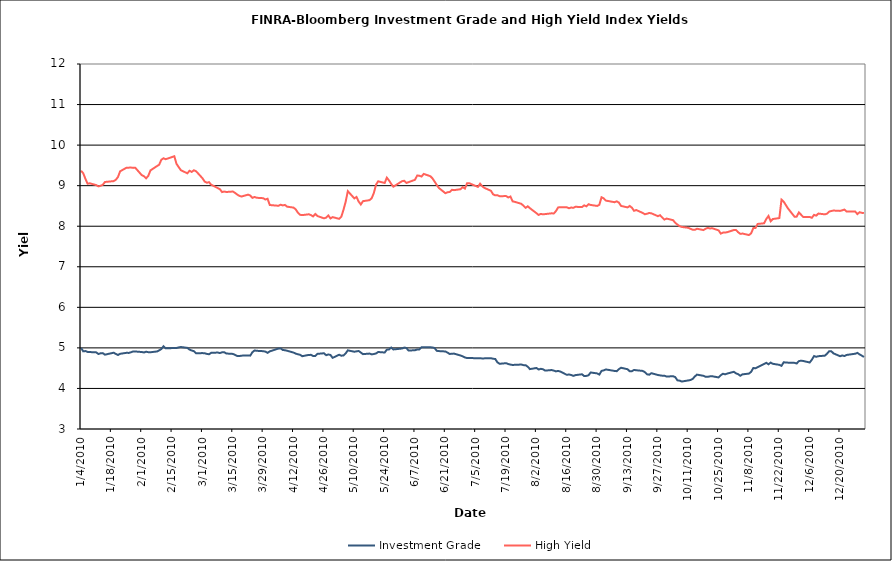
| Category | Investment Grade | High Yield |
|---|---|---|
| 1/4/10 | 4.999 | 9.369 |
| 1/5/10 | 4.915 | 9.304 |
| 1/6/10 | 4.922 | 9.169 |
| 1/7/10 | 4.901 | 9.047 |
| 1/8/10 | 4.898 | 9.058 |
| 1/11/10 | 4.889 | 9.014 |
| 1/12/10 | 4.849 | 8.983 |
| 1/13/10 | 4.867 | 8.998 |
| 1/14/10 | 4.871 | 9.02 |
| 1/15/10 | 4.832 | 9.091 |
| 1/19/10 | 4.881 | 9.112 |
| 1/20/10 | 4.852 | 9.144 |
| 1/21/10 | 4.825 | 9.212 |
| 1/22/10 | 4.854 | 9.354 |
| 1/25/10 | 4.879 | 9.444 |
| 1/26/10 | 4.876 | 9.444 |
| 1/27/10 | 4.892 | 9.447 |
| 1/28/10 | 4.912 | 9.438 |
| 1/29/10 | 4.911 | 9.441 |
| 2/1/10 | 4.898 | 9.258 |
| 2/2/10 | 4.887 | 9.234 |
| 2/3/10 | 4.905 | 9.182 |
| 2/4/10 | 4.894 | 9.243 |
| 2/5/10 | 4.893 | 9.376 |
| 2/8/10 | 4.912 | 9.483 |
| 2/9/10 | 4.939 | 9.516 |
| 2/10/10 | 4.971 | 9.639 |
| 2/11/10 | 5.039 | 9.675 |
| 2/12/10 | 4.988 | 9.653 |
| 2/16/10 | 4.997 | 9.725 |
| 2/17/10 | 4.998 | 9.538 |
| 2/18/10 | 5.011 | 9.459 |
| 2/19/10 | 5.022 | 9.382 |
| 2/22/10 | 5 | 9.304 |
| 2/23/10 | 4.958 | 9.367 |
| 2/24/10 | 4.935 | 9.339 |
| 2/25/10 | 4.92 | 9.38 |
| 2/26/10 | 4.868 | 9.358 |
| 3/1/10 | 4.871 | 9.182 |
| 3/2/10 | 4.868 | 9.1 |
| 3/3/10 | 4.852 | 9.072 |
| 3/4/10 | 4.843 | 9.086 |
| 3/5/10 | 4.878 | 9.023 |
| 3/8/10 | 4.885 | 8.941 |
| 3/9/10 | 4.872 | 8.914 |
| 3/10/10 | 4.891 | 8.842 |
| 3/11/10 | 4.893 | 8.854 |
| 3/12/10 | 4.861 | 8.844 |
| 3/15/10 | 4.852 | 8.855 |
| 3/16/10 | 4.828 | 8.822 |
| 3/17/10 | 4.8 | 8.781 |
| 3/18/10 | 4.799 | 8.748 |
| 3/19/10 | 4.808 | 8.733 |
| 3/22/10 | 4.815 | 8.778 |
| 3/23/10 | 4.809 | 8.757 |
| 3/24/10 | 4.894 | 8.699 |
| 3/25/10 | 4.937 | 8.722 |
| 3/26/10 | 4.928 | 8.701 |
| 3/29/10 | 4.919 | 8.691 |
| 3/30/10 | 4.908 | 8.658 |
| 3/31/10 | 4.877 | 8.678 |
| 4/1/10 | 4.914 | 8.523 |
| 4/5/10 | 4.983 | 8.504 |
| 4/6/10 | 4.988 | 8.531 |
| 4/7/10 | 4.95 | 8.513 |
| 4/8/10 | 4.942 | 8.525 |
| 4/9/10 | 4.93 | 8.482 |
| 4/12/10 | 4.884 | 8.459 |
| 4/13/10 | 4.857 | 8.414 |
| 4/14/10 | 4.843 | 8.332 |
| 4/15/10 | 4.829 | 8.282 |
| 4/16/10 | 4.795 | 8.274 |
| 4/19/10 | 4.827 | 8.295 |
| 4/20/10 | 4.828 | 8.274 |
| 4/21/10 | 4.8 | 8.241 |
| 4/22/10 | 4.802 | 8.303 |
| 4/23/10 | 4.852 | 8.252 |
| 4/26/10 | 4.868 | 8.194 |
| 4/27/10 | 4.82 | 8.211 |
| 4/28/10 | 4.838 | 8.267 |
| 4/29/10 | 4.826 | 8.192 |
| 4/30/10 | 4.754 | 8.225 |
| 5/3/10 | 4.831 | 8.182 |
| 5/4/10 | 4.808 | 8.233 |
| 5/5/10 | 4.814 | 8.404 |
| 5/6/10 | 4.863 | 8.601 |
| 5/7/10 | 4.939 | 8.865 |
| 5/10/10 | 4.906 | 8.687 |
| 5/11/10 | 4.915 | 8.722 |
| 5/12/10 | 4.924 | 8.609 |
| 5/13/10 | 4.885 | 8.536 |
| 5/14/10 | 4.846 | 8.618 |
| 5/17/10 | 4.86 | 8.642 |
| 5/18/10 | 4.84 | 8.689 |
| 5/19/10 | 4.848 | 8.817 |
| 5/20/10 | 4.862 | 9.024 |
| 5/21/10 | 4.898 | 9.108 |
| 5/24/10 | 4.886 | 9.066 |
| 5/25/10 | 4.956 | 9.198 |
| 5/26/10 | 4.962 | 9.128 |
| 5/27/10 | 5.008 | 9.046 |
| 5/28/10 | 4.962 | 8.975 |
| 6/1/10 | 4.985 | 9.11 |
| 6/2/10 | 5.007 | 9.12 |
| 6/3/10 | 4.998 | 9.067 |
| 6/4/10 | 4.934 | 9.086 |
| 6/7/10 | 4.943 | 9.145 |
| 6/8/10 | 4.961 | 9.251 |
| 6/9/10 | 4.962 | 9.245 |
| 6/10/10 | 5.018 | 9.225 |
| 6/11/10 | 5.016 | 9.29 |
| 6/14/10 | 5.015 | 9.235 |
| 6/15/10 | 5.01 | 9.184 |
| 6/16/10 | 4.997 | 9.102 |
| 6/17/10 | 4.929 | 9.019 |
| 6/18/10 | 4.921 | 8.943 |
| 6/21/10 | 4.912 | 8.814 |
| 6/22/10 | 4.884 | 8.838 |
| 6/23/10 | 4.85 | 8.844 |
| 6/24/10 | 4.857 | 8.898 |
| 6/25/10 | 4.859 | 8.889 |
| 6/28/10 | 4.812 | 8.913 |
| 6/29/10 | 4.792 | 8.964 |
| 6/30/10 | 4.765 | 8.929 |
| 7/1/10 | 4.749 | 9.058 |
| 7/2/10 | 4.751 | 9.06 |
| 7/6/10 | 4.744 | 8.97 |
| 7/7/10 | 4.747 | 9.049 |
| 7/8/10 | 4.738 | 8.984 |
| 7/9/10 | 4.742 | 8.945 |
| 7/12/10 | 4.745 | 8.874 |
| 7/13/10 | 4.732 | 8.787 |
| 7/14/10 | 4.726 | 8.762 |
| 7/15/10 | 4.643 | 8.764 |
| 7/16/10 | 4.608 | 8.74 |
| 7/19/10 | 4.623 | 8.743 |
| 7/20/10 | 4.602 | 8.709 |
| 7/21/10 | 4.588 | 8.733 |
| 7/22/10 | 4.579 | 8.613 |
| 7/23/10 | 4.582 | 8.602 |
| 7/26/10 | 4.589 | 8.552 |
| 7/27/10 | 4.575 | 8.506 |
| 7/28/10 | 4.574 | 8.454 |
| 7/29/10 | 4.534 | 8.491 |
| 7/30/10 | 4.477 | 8.443 |
| 8/2/10 | 4.504 | 8.321 |
| 8/3/10 | 4.467 | 8.278 |
| 8/4/10 | 4.484 | 8.304 |
| 8/5/10 | 4.473 | 8.293 |
| 8/6/10 | 4.44 | 8.299 |
| 8/9/10 | 4.454 | 8.318 |
| 8/10/10 | 4.44 | 8.314 |
| 8/11/10 | 4.421 | 8.374 |
| 8/12/10 | 4.432 | 8.464 |
| 8/13/10 | 4.416 | 8.47 |
| 8/16/10 | 4.335 | 8.467 |
| 8/17/10 | 4.344 | 8.442 |
| 8/18/10 | 4.332 | 8.461 |
| 8/19/10 | 4.31 | 8.454 |
| 8/20/10 | 4.329 | 8.479 |
| 8/23/10 | 4.349 | 8.472 |
| 8/24/10 | 4.305 | 8.515 |
| 8/25/10 | 4.309 | 8.491 |
| 8/26/10 | 4.325 | 8.543 |
| 8/27/10 | 4.393 | 8.524 |
| 8/30/10 | 4.371 | 8.5 |
| 8/31/10 | 4.342 | 8.529 |
| 9/1/10 | 4.432 | 8.714 |
| 9/2/10 | 4.446 | 8.687 |
| 9/3/10 | 4.468 | 8.632 |
| 9/7/10 | 4.432 | 8.592 |
| 9/8/10 | 4.426 | 8.613 |
| 9/9/10 | 4.476 | 8.584 |
| 9/10/10 | 4.51 | 8.5 |
| 9/13/10 | 4.474 | 8.464 |
| 9/14/10 | 4.423 | 8.499 |
| 9/15/10 | 4.426 | 8.457 |
| 9/16/10 | 4.456 | 8.38 |
| 9/17/10 | 4.449 | 8.4 |
| 9/20/10 | 4.432 | 8.328 |
| 9/21/10 | 4.401 | 8.294 |
| 9/22/10 | 4.349 | 8.309 |
| 9/23/10 | 4.339 | 8.327 |
| 9/24/10 | 4.376 | 8.318 |
| 9/27/10 | 4.332 | 8.248 |
| 9/28/10 | 4.323 | 8.271 |
| 9/29/10 | 4.314 | 8.214 |
| 9/30/10 | 4.314 | 8.164 |
| 10/1/10 | 4.294 | 8.189 |
| 10/4/10 | 4.301 | 8.149 |
| 10/5/10 | 4.278 | 8.084 |
| 10/6/10 | 4.2 | 8.041 |
| 10/7/10 | 4.192 | 8 |
| 10/8/10 | 4.171 | 7.982 |
| 10/11/10 | 4.197 | 7.961 |
| 10/12/10 | 4.208 | 7.936 |
| 10/13/10 | 4.232 | 7.914 |
| 10/14/10 | 4.294 | 7.911 |
| 10/15/10 | 4.341 | 7.938 |
| 10/18/10 | 4.312 | 7.905 |
| 10/19/10 | 4.287 | 7.938 |
| 10/20/10 | 4.287 | 7.959 |
| 10/21/10 | 4.298 | 7.945 |
| 10/22/10 | 4.301 | 7.951 |
| 10/25/10 | 4.271 | 7.898 |
| 10/26/10 | 4.326 | 7.816 |
| 10/27/10 | 4.362 | 7.843 |
| 10/28/10 | 4.348 | 7.844 |
| 10/29/10 | 4.367 | 7.853 |
| 11/1/10 | 4.41 | 7.906 |
| 11/2/10 | 4.372 | 7.909 |
| 11/3/10 | 4.352 | 7.851 |
| 11/4/10 | 4.313 | 7.812 |
| 11/5/10 | 4.348 | 7.819 |
| 11/8/10 | 4.366 | 7.782 |
| 11/9/10 | 4.411 | 7.825 |
| 11/10/10 | 4.505 | 7.954 |
| 11/11/10 | 4.497 | 7.956 |
| 11/12/10 | 4.524 | 8.056 |
| 11/15/10 | 4.605 | 8.073 |
| 11/16/10 | 4.631 | 8.181 |
| 11/17/10 | 4.596 | 8.253 |
| 11/18/10 | 4.637 | 8.124 |
| 11/19/10 | 4.608 | 8.178 |
| 11/22/10 | 4.582 | 8.201 |
| 11/23/10 | 4.557 | 8.656 |
| 11/24/10 | 4.645 | 8.606 |
| 11/26/10 | 4.636 | 8.437 |
| 11/29/10 | 4.63 | 8.235 |
| 11/30/10 | 4.615 | 8.237 |
| 12/1/10 | 4.674 | 8.34 |
| 12/2/10 | 4.685 | 8.285 |
| 12/3/10 | 4.677 | 8.227 |
| 12/6/10 | 4.64 | 8.229 |
| 12/7/10 | 4.709 | 8.208 |
| 12/8/10 | 4.799 | 8.279 |
| 12/9/10 | 4.78 | 8.261 |
| 12/10/10 | 4.795 | 8.312 |
| 12/13/10 | 4.808 | 8.292 |
| 12/14/10 | 4.858 | 8.31 |
| 12/15/10 | 4.919 | 8.361 |
| 12/16/10 | 4.915 | 8.376 |
| 12/17/10 | 4.864 | 8.387 |
| 12/20/10 | 4.795 | 8.378 |
| 12/21/10 | 4.813 | 8.392 |
| 12/22/10 | 4.8 | 8.41 |
| 12/23/10 | 4.826 | 8.364 |
| 12/27/10 | 4.857 | 8.361 |
| 12/28/10 | 4.876 | 8.299 |
| 12/29/10 | 4.839 | 8.346 |
| 12/30/10 | 4.81 | 8.33 |
| 12/31/10 | 4.776 | 8.325 |